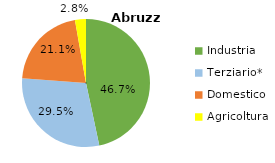
| Category | Abruzzo |
|---|---|
| Industria | 0.467 |
| Terziario* | 0.295 |
| Domestico | 0.211 |
| Agricoltura | 0.028 |